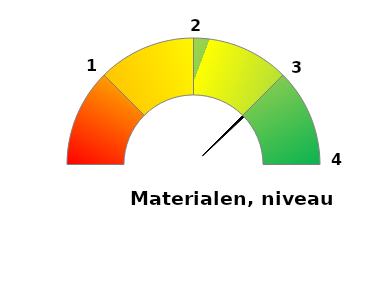
| Category | Variable | Fixe |
|---|---|---|
| 0.0 | 0.75 | 0 |
| 1.0 | 0.01 | 25 |
| 2.0 | 0.24 | 25 |
| 3.0 | 0 | 25 |
| 4.0 | 0 | 25 |
| 5.0 | 1 | 100 |